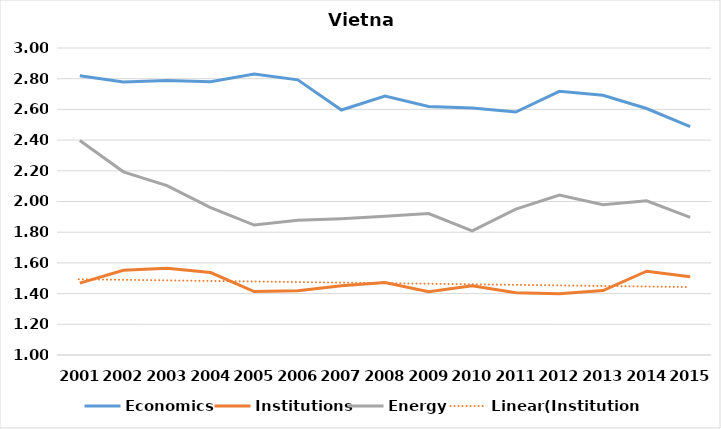
| Category | Economics | Institutions | Energy |
|---|---|---|---|
| 2001.0 | 2.819 | 1.468 | 2.398 |
| 2002.0 | 2.778 | 1.552 | 2.193 |
| 2003.0 | 2.789 | 1.565 | 2.104 |
| 2004.0 | 2.78 | 1.537 | 1.96 |
| 2005.0 | 2.831 | 1.413 | 1.847 |
| 2006.0 | 2.792 | 1.419 | 1.878 |
| 2007.0 | 2.596 | 1.451 | 1.888 |
| 2008.0 | 2.687 | 1.472 | 1.904 |
| 2009.0 | 2.618 | 1.412 | 1.921 |
| 2010.0 | 2.61 | 1.451 | 1.808 |
| 2011.0 | 2.583 | 1.406 | 1.951 |
| 2012.0 | 2.717 | 1.398 | 2.042 |
| 2013.0 | 2.692 | 1.42 | 1.98 |
| 2014.0 | 2.606 | 1.546 | 2.005 |
| 2015.0 | 2.488 | 1.51 | 1.897 |